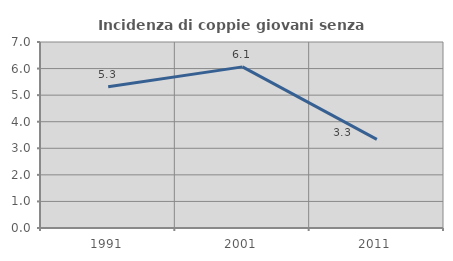
| Category | Incidenza di coppie giovani senza figli |
|---|---|
| 1991.0 | 5.314 |
| 2001.0 | 6.064 |
| 2011.0 | 3.333 |